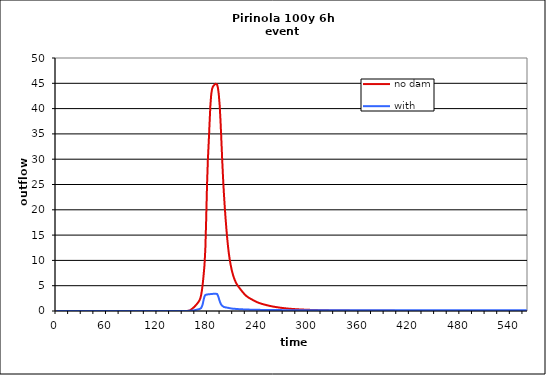
| Category | no dam | with dam |
|---|---|---|
| 0.0 | 0 | 0 |
| 1.0 | 0 | 0 |
| 2.0 | 0 | 0 |
| 3.0 | 0 | 0 |
| 4.0 | 0 | 0 |
| 5.0 | 0 | 0 |
| 6.0 | 0 | 0 |
| 7.0 | 0 | 0 |
| 8.0 | 0 | 0 |
| 9.0 | 0 | 0 |
| 10.0 | 0 | 0 |
| 11.0 | 0 | 0 |
| 12.0 | 0 | 0 |
| 13.0 | 0 | 0 |
| 14.0 | 0 | 0 |
| 15.0 | 0 | 0 |
| 16.0 | 0 | 0 |
| 17.0 | 0 | 0 |
| 18.0 | 0 | 0 |
| 19.0 | 0 | 0 |
| 20.0 | 0 | 0 |
| 21.0 | 0 | 0 |
| 22.0 | 0 | 0 |
| 23.0 | 0 | 0 |
| 24.0 | 0 | 0 |
| 25.0 | 0 | 0 |
| 26.0 | 0 | 0 |
| 27.0 | 0 | 0 |
| 28.0 | 0 | 0 |
| 29.0 | 0 | 0 |
| 30.0 | 0 | 0 |
| 31.0 | 0 | 0 |
| 32.0 | 0 | 0 |
| 33.0 | 0 | 0 |
| 34.0 | 0 | 0 |
| 35.0 | 0 | 0 |
| 36.0 | 0 | 0 |
| 37.0 | 0 | 0 |
| 38.0 | 0 | 0 |
| 39.0 | 0 | 0 |
| 40.0 | 0 | 0 |
| 41.0 | 0 | 0 |
| 42.0 | 0 | 0 |
| 43.0 | 0 | 0 |
| 44.0 | 0 | 0 |
| 45.0 | 0 | 0 |
| 46.0 | 0 | 0 |
| 47.0 | 0 | 0 |
| 48.0 | 0 | 0 |
| 49.0 | 0 | 0 |
| 50.0 | 0 | 0 |
| 51.0 | 0 | 0 |
| 52.0 | 0 | 0 |
| 53.0 | 0 | 0 |
| 54.0 | 0 | 0 |
| 55.0 | 0 | 0 |
| 56.0 | 0 | 0 |
| 57.0 | 0 | 0 |
| 58.0 | 0 | 0 |
| 59.0 | 0 | 0 |
| 60.0 | 0 | 0 |
| 61.0 | 0 | 0 |
| 62.0 | 0 | 0 |
| 63.0 | 0 | 0 |
| 64.0 | 0 | 0 |
| 65.0 | 0 | 0 |
| 66.0 | 0 | 0 |
| 67.0 | 0 | 0 |
| 68.0 | 0 | 0 |
| 69.0 | 0 | 0 |
| 70.0 | 0 | 0 |
| 71.0 | 0 | 0 |
| 72.0 | 0 | 0 |
| 73.0 | 0 | 0 |
| 74.0 | 0 | 0 |
| 75.0 | 0 | 0 |
| 76.0 | 0 | 0 |
| 77.0 | 0 | 0 |
| 78.0 | 0 | 0 |
| 79.0 | 0 | 0 |
| 80.0 | 0 | 0 |
| 81.0 | 0 | 0 |
| 82.0 | 0 | 0 |
| 83.0 | 0 | 0 |
| 84.0 | 0 | 0 |
| 85.0 | 0 | 0 |
| 86.0 | 0 | 0 |
| 87.0 | 0 | 0 |
| 88.0 | 0 | 0 |
| 89.0 | 0 | 0 |
| 90.0 | 0 | 0 |
| 91.0 | 0 | 0 |
| 92.0 | 0 | 0 |
| 93.0 | 0 | 0 |
| 94.0 | 0 | 0 |
| 95.0 | 0 | 0 |
| 96.0 | 0 | 0 |
| 97.0 | 0 | 0 |
| 98.0 | 0 | 0 |
| 99.0 | 0 | 0 |
| 100.0 | 0 | 0 |
| 101.0 | 0 | 0 |
| 102.0 | 0 | 0 |
| 103.0 | 0 | 0 |
| 104.0 | 0 | 0 |
| 105.0 | 0 | 0 |
| 106.0 | 0 | 0 |
| 107.0 | 0 | 0 |
| 108.0 | 0 | 0 |
| 109.0 | 0 | 0 |
| 110.0 | 0 | 0 |
| 111.0 | 0 | 0 |
| 112.0 | 0 | 0 |
| 113.0 | 0 | 0 |
| 114.0 | 0 | 0 |
| 115.0 | 0 | 0 |
| 116.0 | 0 | 0 |
| 117.0 | 0 | 0 |
| 118.0 | 0 | 0 |
| 119.0 | 0 | 0 |
| 120.0 | 0 | 0 |
| 121.0 | 0 | 0 |
| 122.0 | 0 | 0 |
| 123.0 | 0 | 0 |
| 124.0 | 0 | 0 |
| 125.0 | 0 | 0 |
| 126.0 | 0 | 0 |
| 127.0 | 0 | 0 |
| 128.0 | 0 | 0 |
| 129.0 | 0 | 0 |
| 130.0 | 0 | 0 |
| 131.0 | 0 | 0 |
| 132.0 | 0 | 0 |
| 133.0 | 0 | 0 |
| 134.0 | 0 | 0 |
| 135.0 | 0 | 0 |
| 136.0 | 0 | 0 |
| 137.0 | 0.001 | 0.001 |
| 138.0 | 0.001 | 0.001 |
| 139.0 | 0.001 | 0.001 |
| 140.0 | 0.001 | 0.001 |
| 141.0 | 0.001 | 0.001 |
| 142.0 | 0.001 | 0.001 |
| 143.0 | 0.001 | 0.001 |
| 144.0 | 0.001 | 0.001 |
| 145.0 | 0.001 | 0.001 |
| 146.0 | 0.002 | 0.002 |
| 147.0 | 0.002 | 0.002 |
| 148.0 | 0.002 | 0.002 |
| 149.0 | 0.002 | 0.002 |
| 150.0 | 0.003 | 0.003 |
| 151.0 | 0.005 | 0.004 |
| 152.0 | 0.008 | 0.006 |
| 153.0 | 0.013 | 0.009 |
| 154.0 | 0.016 | 0.013 |
| 155.0 | 0.022 | 0.016 |
| 156.0 | 0.026 | 0.02 |
| 157.0 | 0.043 | 0.026 |
| 158.0 | 0.055 | 0.036 |
| 159.0 | 0.067 | 0.047 |
| 160.0 | 0.277 | 0.06 |
| 161.0 | 0.408 | 0.073 |
| 162.0 | 0.532 | 0.09 |
| 163.0 | 0.673 | 0.113 |
| 164.0 | 0.833 | 0.141 |
| 165.0 | 1.008 | 0.176 |
| 166.0 | 1.192 | 0.216 |
| 167.0 | 1.387 | 0.258 |
| 168.0 | 1.597 | 0.302 |
| 169.0 | 1.831 | 0.345 |
| 170.0 | 2.105 | 0.38 |
| 171.0 | 2.48 | 0.439 |
| 172.0 | 3.133 | 0.579 |
| 173.0 | 4.147 | 0.906 |
| 174.0 | 5.497 | 1.43 |
| 175.0 | 7.191 | 2.252 |
| 176.0 | 9.084 | 2.879 |
| 177.0 | 12.233 | 3.162 |
| 178.0 | 18.059 | 3.241 |
| 179.0 | 24.909 | 3.268 |
| 180.0 | 29.807 | 3.286 |
| 181.0 | 33.294 | 3.302 |
| 182.0 | 37.073 | 3.319 |
| 183.0 | 40.638 | 3.336 |
| 184.0 | 42.834 | 3.353 |
| 185.0 | 43.863 | 3.371 |
| 186.0 | 44.328 | 3.389 |
| 187.0 | 44.581 | 3.406 |
| 188.0 | 44.752 | 3.42 |
| 189.0 | 44.887 | 3.432 |
| 190.0 | 45.008 | 3.443 |
| 191.0 | 44.772 | 3.349 |
| 192.0 | 44.061 | 3.025 |
| 193.0 | 42.776 | 2.529 |
| 194.0 | 40.706 | 1.976 |
| 195.0 | 37.684 | 1.536 |
| 196.0 | 33.949 | 1.235 |
| 197.0 | 30.068 | 1.034 |
| 198.0 | 26.477 | 0.899 |
| 199.0 | 23.395 | 0.808 |
| 200.0 | 20.759 | 0.75 |
| 201.0 | 18.399 | 0.713 |
| 202.0 | 16.256 | 0.686 |
| 203.0 | 14.345 | 0.659 |
| 204.0 | 12.689 | 0.628 |
| 205.0 | 11.296 | 0.594 |
| 206.0 | 10.147 | 0.557 |
| 207.0 | 9.186 | 0.522 |
| 208.0 | 8.368 | 0.493 |
| 209.0 | 7.675 | 0.471 |
| 210.0 | 7.079 | 0.454 |
| 211.0 | 6.56 | 0.44 |
| 212.0 | 6.114 | 0.428 |
| 213.0 | 5.735 | 0.416 |
| 214.0 | 5.416 | 0.403 |
| 215.0 | 5.146 | 0.39 |
| 216.0 | 4.905 | 0.377 |
| 217.0 | 4.68 | 0.364 |
| 218.0 | 4.46 | 0.352 |
| 219.0 | 4.242 | 0.341 |
| 220.0 | 4.025 | 0.332 |
| 221.0 | 3.814 | 0.325 |
| 222.0 | 3.612 | 0.318 |
| 223.0 | 3.419 | 0.312 |
| 224.0 | 3.241 | 0.306 |
| 225.0 | 3.079 | 0.299 |
| 226.0 | 2.933 | 0.292 |
| 227.0 | 2.804 | 0.285 |
| 228.0 | 2.69 | 0.279 |
| 229.0 | 2.587 | 0.273 |
| 230.0 | 2.492 | 0.268 |
| 231.0 | 2.401 | 0.263 |
| 232.0 | 2.31 | 0.259 |
| 233.0 | 2.218 | 0.255 |
| 234.0 | 2.125 | 0.251 |
| 235.0 | 2.035 | 0.247 |
| 236.0 | 1.946 | 0.243 |
| 237.0 | 1.861 | 0.239 |
| 238.0 | 1.782 | 0.235 |
| 239.0 | 1.709 | 0.232 |
| 240.0 | 1.641 | 0.228 |
| 241.0 | 1.58 | 0.225 |
| 242.0 | 1.523 | 0.222 |
| 243.0 | 1.469 | 0.219 |
| 244.0 | 1.419 | 0.217 |
| 245.0 | 1.371 | 0.214 |
| 246.0 | 1.324 | 0.211 |
| 247.0 | 1.279 | 0.209 |
| 248.0 | 1.234 | 0.206 |
| 249.0 | 1.19 | 0.204 |
| 250.0 | 1.148 | 0.202 |
| 251.0 | 1.107 | 0.2 |
| 252.0 | 1.067 | 0.198 |
| 253.0 | 1.029 | 0.196 |
| 254.0 | 0.993 | 0.194 |
| 255.0 | 0.958 | 0.192 |
| 256.0 | 0.925 | 0.19 |
| 257.0 | 0.894 | 0.188 |
| 258.0 | 0.863 | 0.186 |
| 259.0 | 0.834 | 0.184 |
| 260.0 | 0.806 | 0.183 |
| 261.0 | 0.779 | 0.181 |
| 262.0 | 0.752 | 0.18 |
| 263.0 | 0.727 | 0.179 |
| 264.0 | 0.702 | 0.177 |
| 265.0 | 0.677 | 0.176 |
| 266.0 | 0.654 | 0.175 |
| 267.0 | 0.631 | 0.173 |
| 268.0 | 0.609 | 0.172 |
| 269.0 | 0.588 | 0.171 |
| 270.0 | 0.568 | 0.17 |
| 271.0 | 0.549 | 0.169 |
| 272.0 | 0.531 | 0.168 |
| 273.0 | 0.514 | 0.167 |
| 274.0 | 0.498 | 0.166 |
| 275.0 | 0.482 | 0.165 |
| 276.0 | 0.467 | 0.164 |
| 277.0 | 0.452 | 0.164 |
| 278.0 | 0.439 | 0.163 |
| 279.0 | 0.425 | 0.162 |
| 280.0 | 0.413 | 0.161 |
| 281.0 | 0.4 | 0.161 |
| 282.0 | 0.388 | 0.16 |
| 283.0 | 0.377 | 0.159 |
| 284.0 | 0.366 | 0.159 |
| 285.0 | 0.355 | 0.158 |
| 286.0 | 0.344 | 0.157 |
| 287.0 | 0.334 | 0.157 |
| 288.0 | 0.325 | 0.156 |
| 289.0 | 0.315 | 0.156 |
| 290.0 | 0.306 | 0.155 |
| 291.0 | 0.297 | 0.155 |
| 292.0 | 0.289 | 0.154 |
| 293.0 | 0.281 | 0.154 |
| 294.0 | 0.273 | 0.153 |
| 295.0 | 0.265 | 0.153 |
| 296.0 | 0.257 | 0.152 |
| 297.0 | 0.25 | 0.152 |
| 298.0 | 0.243 | 0.152 |
| 299.0 | 0.236 | 0.151 |
| 300.0 | 0.23 | 0.151 |
| 301.0 | 0.223 | 0.151 |
| 302.0 | 0.217 | 0.15 |
| 303.0 | 0.211 | 0.15 |
| 304.0 | 0.206 | 0.15 |
| 305.0 | 0.2 | 0.15 |
| 306.0 | 0.195 | 0.149 |
| 307.0 | 0.189 | 0.149 |
| 308.0 | 0.184 | 0.149 |
| 309.0 | 0.179 | 0.149 |
| 310.0 | 0.175 | 0.148 |
| 311.0 | 0.17 | 0.148 |
| 312.0 | 0.166 | 0.148 |
| 313.0 | 0.161 | 0.148 |
| 314.0 | 0.157 | 0.148 |
| 315.0 | 0.153 | 0.148 |
| 316.0 | 0.149 | 0.148 |
| 317.0 | 0.146 | 0.147 |
| 318.0 | 0.142 | 0.147 |
| 319.0 | 0.138 | 0.147 |
| 320.0 | 0.135 | 0.147 |
| 321.0 | 0.132 | 0.147 |
| 322.0 | 0.128 | 0.147 |
| 323.0 | 0.125 | 0.147 |
| 324.0 | 0.122 | 0.147 |
| 325.0 | 0.12 | 0.147 |
| 326.0 | 0.117 | 0.147 |
| 327.0 | 0.114 | 0.147 |
| 328.0 | 0.112 | 0.147 |
| 329.0 | 0.109 | 0.147 |
| 330.0 | 0.107 | 0.147 |
| 331.0 | 0.105 | 0.147 |
| 332.0 | 0.103 | 0.147 |
| 333.0 | 0.1 | 0.147 |
| 334.0 | 0.098 | 0.147 |
| 335.0 | 0.096 | 0.147 |
| 336.0 | 0.094 | 0.147 |
| 337.0 | 0.092 | 0.147 |
| 338.0 | 0.091 | 0.147 |
| 339.0 | 0.089 | 0.147 |
| 340.0 | 0.087 | 0.147 |
| 341.0 | 0.086 | 0.147 |
| 342.0 | 0.084 | 0.147 |
| 343.0 | 0.082 | 0.147 |
| 344.0 | 0.081 | 0.147 |
| 345.0 | 0.079 | 0.147 |
| 346.0 | 0.078 | 0.147 |
| 347.0 | 0.076 | 0.147 |
| 348.0 | 0.075 | 0.147 |
| 349.0 | 0.073 | 0.147 |
| 350.0 | 0.072 | 0.147 |
| 351.0 | 0.07 | 0.147 |
| 352.0 | 0.069 | 0.147 |
| 353.0 | 0.068 | 0.147 |
| 354.0 | 0.066 | 0.147 |
| 355.0 | 0.065 | 0.146 |
| 356.0 | 0.064 | 0.146 |
| 357.0 | 0.063 | 0.146 |
| 358.0 | 0.061 | 0.146 |
| 359.0 | 0.06 | 0.146 |
| 360.0 | 0.059 | 0.146 |
| 361.0 | 0.058 | 0.146 |
| 362.0 | 0.057 | 0.146 |
| 363.0 | 0.056 | 0.146 |
| 364.0 | 0.055 | 0.146 |
| 365.0 | 0.053 | 0.146 |
| 366.0 | 0.052 | 0.146 |
| 367.0 | 0.051 | 0.146 |
| 368.0 | 0.05 | 0.146 |
| 369.0 | 0.049 | 0.146 |
| 370.0 | 0.049 | 0.146 |
| 371.0 | 0.048 | 0.146 |
| 372.0 | 0.047 | 0.146 |
| 373.0 | 0.046 | 0.146 |
| 374.0 | 0.045 | 0.146 |
| 375.0 | 0.044 | 0.146 |
| 376.0 | 0.043 | 0.146 |
| 377.0 | 0.042 | 0.146 |
| 378.0 | 0.042 | 0.146 |
| 379.0 | 0.041 | 0.146 |
| 380.0 | 0.04 | 0.146 |
| 381.0 | 0.039 | 0.146 |
| 382.0 | 0.038 | 0.146 |
| 383.0 | 0.038 | 0.146 |
| 384.0 | 0.037 | 0.146 |
| 385.0 | 0.036 | 0.146 |
| 386.0 | 0.036 | 0.146 |
| 387.0 | 0.035 | 0.146 |
| 388.0 | 0.034 | 0.146 |
| 389.0 | 0.033 | 0.146 |
| 390.0 | 0.033 | 0.146 |
| 391.0 | 0.032 | 0.146 |
| 392.0 | 0.031 | 0.146 |
| 393.0 | 0.03 | 0.146 |
| 394.0 | 0.03 | 0.146 |
| 395.0 | 0.029 | 0.146 |
| 396.0 | 0.028 | 0.146 |
| 397.0 | 0.028 | 0.146 |
| 398.0 | 0.027 | 0.146 |
| 399.0 | 0.026 | 0.146 |
| 400.0 | 0.026 | 0.146 |
| 401.0 | 0.025 | 0.146 |
| 402.0 | 0.025 | 0.146 |
| 403.0 | 0.024 | 0.146 |
| 404.0 | 0.024 | 0.146 |
| 405.0 | 0.023 | 0.146 |
| 406.0 | 0.023 | 0.146 |
| 407.0 | 0.022 | 0.146 |
| 408.0 | 0.021 | 0.146 |
| 409.0 | 0.021 | 0.146 |
| 410.0 | 0.02 | 0.146 |
| 411.0 | 0.02 | 0.146 |
| 412.0 | 0.019 | 0.146 |
| 413.0 | 0.018 | 0.146 |
| 414.0 | 0.018 | 0.146 |
| 415.0 | 0.017 | 0.146 |
| 416.0 | 0.017 | 0.146 |
| 417.0 | 0.016 | 0.146 |
| 418.0 | 0.015 | 0.146 |
| 419.0 | 0.015 | 0.146 |
| 420.0 | 0.014 | 0.146 |
| 421.0 | 0.014 | 0.146 |
| 422.0 | 0.013 | 0.146 |
| 423.0 | 0.013 | 0.146 |
| 424.0 | 0.012 | 0.146 |
| 425.0 | 0.012 | 0.146 |
| 426.0 | 0.011 | 0.146 |
| 427.0 | 0.011 | 0.146 |
| 428.0 | 0.01 | 0.146 |
| 429.0 | 0.01 | 0.146 |
| 430.0 | 0.009 | 0.146 |
| 431.0 | 0.009 | 0.146 |
| 432.0 | 0.009 | 0.146 |
| 433.0 | 0.008 | 0.146 |
| 434.0 | 0.008 | 0.146 |
| 435.0 | 0.007 | 0.146 |
| 436.0 | 0.007 | 0.146 |
| 437.0 | 0.007 | 0.146 |
| 438.0 | 0.006 | 0.146 |
| 439.0 | 0.006 | 0.146 |
| 440.0 | 0.006 | 0.146 |
| 441.0 | 0.006 | 0.145 |
| 442.0 | 0.005 | 0.145 |
| 443.0 | 0.005 | 0.145 |
| 444.0 | 0.005 | 0.145 |
| 445.0 | 0.004 | 0.145 |
| 446.0 | 0.004 | 0.145 |
| 447.0 | 0.004 | 0.145 |
| 448.0 | 0.004 | 0.145 |
| 449.0 | 0.004 | 0.145 |
| 450.0 | 0.003 | 0.145 |
| 451.0 | 0.003 | 0.145 |
| 452.0 | 0.003 | 0.145 |
| 453.0 | 0.003 | 0.145 |
| 454.0 | 0.003 | 0.145 |
| 455.0 | 0.003 | 0.145 |
| 456.0 | 0.002 | 0.145 |
| 457.0 | 0.002 | 0.145 |
| 458.0 | 0.002 | 0.145 |
| 459.0 | 0.002 | 0.145 |
| 460.0 | 0.002 | 0.145 |
| 461.0 | 0.002 | 0.145 |
| 462.0 | 0.002 | 0.145 |
| 463.0 | 0.001 | 0.145 |
| 464.0 | 0.001 | 0.145 |
| 465.0 | 0.001 | 0.145 |
| 466.0 | 0.001 | 0.145 |
| 467.0 | 0.001 | 0.145 |
| 468.0 | 0.001 | 0.145 |
| 469.0 | 0.001 | 0.145 |
| 470.0 | 0.001 | 0.145 |
| 471.0 | 0.001 | 0.145 |
| 472.0 | 0.001 | 0.145 |
| 473.0 | 0.001 | 0.145 |
| 474.0 | 0.001 | 0.145 |
| 475.0 | 0.001 | 0.145 |
| 476.0 | 0.001 | 0.145 |
| 477.0 | 0.001 | 0.145 |
| 478.0 | 0 | 0.145 |
| 479.0 | 0 | 0.145 |
| 480.0 | 0 | 0.145 |
| 481.0 | 0 | 0.145 |
| 482.0 | 0 | 0.145 |
| 483.0 | 0 | 0.145 |
| 484.0 | 0 | 0.145 |
| 485.0 | 0 | 0.145 |
| 486.0 | 0 | 0.145 |
| 487.0 | 0 | 0.145 |
| 488.0 | 0 | 0.145 |
| 489.0 | 0 | 0.145 |
| 490.0 | 0 | 0.145 |
| 491.0 | 0 | 0.145 |
| 492.0 | 0 | 0.145 |
| 493.0 | 0 | 0.145 |
| 494.0 | 0 | 0.145 |
| 495.0 | 0 | 0.145 |
| 496.0 | 0 | 0.145 |
| 497.0 | 0 | 0.145 |
| 498.0 | 0 | 0.145 |
| 499.0 | 0 | 0.145 |
| 500.0 | 0 | 0.145 |
| 501.0 | 0 | 0.145 |
| 502.0 | 0 | 0.145 |
| 503.0 | 0 | 0.145 |
| 504.0 | 0 | 0.145 |
| 505.0 | 0 | 0.145 |
| 506.0 | 0 | 0.145 |
| 507.0 | 0 | 0.145 |
| 508.0 | 0 | 0.145 |
| 509.0 | 0 | 0.144 |
| 510.0 | 0 | 0.144 |
| 511.0 | 0 | 0.144 |
| 512.0 | 0 | 0.144 |
| 513.0 | 0 | 0.144 |
| 514.0 | 0 | 0.144 |
| 515.0 | 0 | 0.144 |
| 516.0 | 0 | 0.144 |
| 517.0 | 0 | 0.144 |
| 518.0 | 0 | 0.144 |
| 519.0 | 0 | 0.144 |
| 520.0 | 0 | 0.144 |
| 521.0 | 0 | 0.144 |
| 522.0 | 0 | 0.144 |
| 523.0 | 0 | 0.144 |
| 524.0 | 0 | 0.144 |
| 525.0 | 0 | 0.144 |
| 526.0 | 0 | 0.144 |
| 527.0 | 0 | 0.144 |
| 528.0 | 0 | 0.144 |
| 529.0 | 0 | 0.144 |
| 530.0 | 0 | 0.144 |
| 531.0 | 0 | 0.144 |
| 532.0 | 0 | 0.144 |
| 533.0 | 0 | 0.144 |
| 534.0 | 0 | 0.144 |
| 535.0 | 0 | 0.144 |
| 536.0 | 0 | 0.144 |
| 537.0 | 0 | 0.144 |
| 538.0 | 0 | 0.144 |
| 539.0 | 0 | 0.144 |
| 540.0 | 0 | 0.144 |
| 541.0 | 0 | 0.144 |
| 542.0 | 0 | 0.144 |
| 543.0 | 0 | 0.144 |
| 544.0 | 0 | 0.144 |
| 545.0 | 0 | 0.144 |
| 546.0 | 0 | 0.144 |
| 547.0 | 0 | 0.144 |
| 548.0 | 0 | 0.144 |
| 549.0 | 0 | 0.144 |
| 550.0 | 0 | 0.144 |
| 551.0 | 0 | 0.144 |
| 552.0 | 0 | 0.144 |
| 553.0 | 0 | 0.144 |
| 554.0 | 0 | 0.144 |
| 555.0 | 0 | 0.144 |
| 556.0 | 0 | 0.144 |
| 557.0 | 0 | 0.144 |
| 558.0 | 0 | 0.144 |
| 559.0 | 0 | 0.144 |
| 560.0 | 0 | 0.144 |